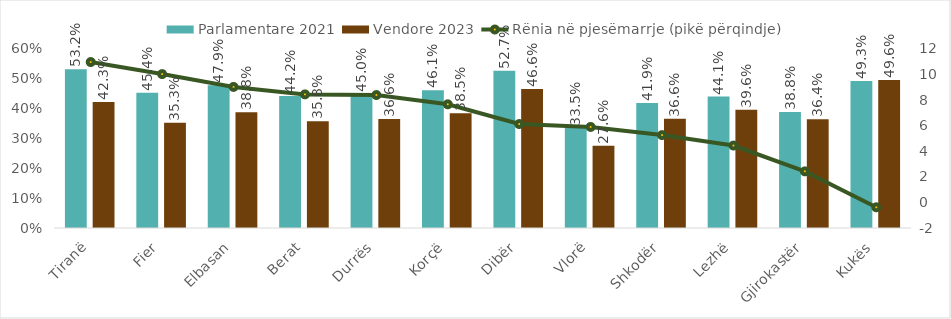
| Category | Parlamentare 2021 | Vendore 2023 |
|---|---|---|
| Tiranë | 0.532 | 0.423 |
| Fier | 0.454 | 0.353 |
| Elbasan | 0.479 | 0.388 |
| Berat | 0.442 | 0.358 |
| Durrës | 0.45 | 0.366 |
| Korçë | 0.461 | 0.385 |
| Dibër | 0.527 | 0.466 |
| Vlorë | 0.335 | 0.276 |
| Shkodër | 0.419 | 0.366 |
| Lezhë | 0.441 | 0.396 |
| Gjirokastër | 0.388 | 0.364 |
| Kukës | 0.493 | 0.496 |